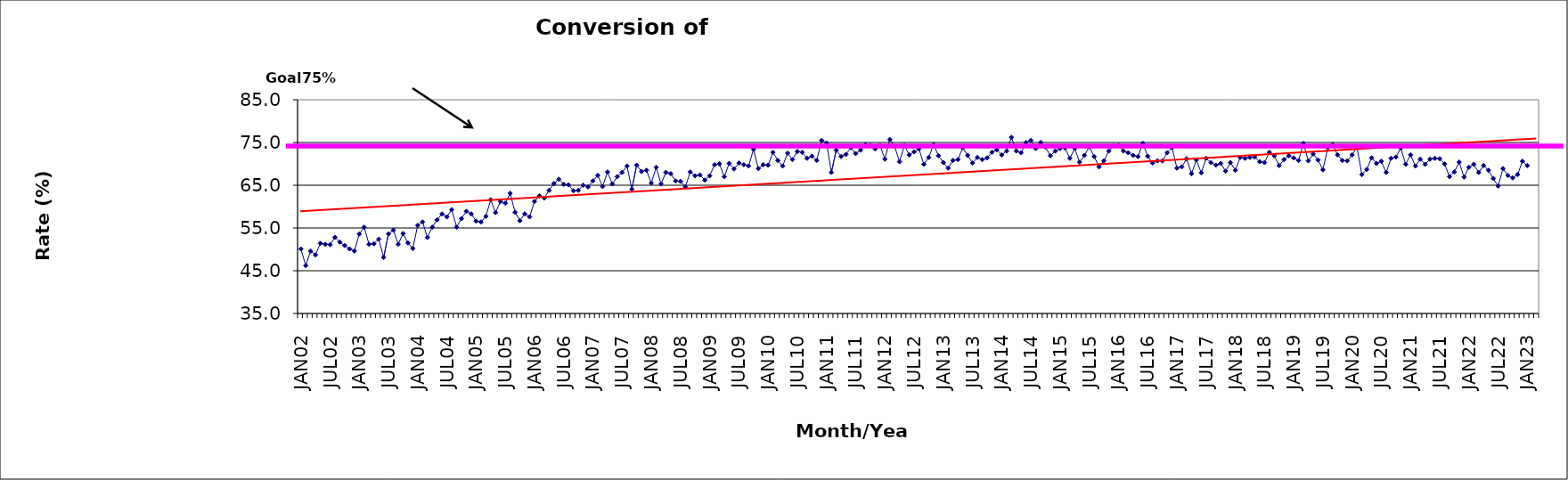
| Category | Series 0 |
|---|---|
| JAN02 | 50.1 |
| FEB02 | 46.2 |
| MAR02 | 49.6 |
| APR02 | 48.7 |
| MAY02 | 51.4 |
| JUN02 | 51.2 |
| JUL02 | 51.1 |
| AUG02 | 52.8 |
| SEP02 | 51.7 |
| OCT02 | 50.9 |
| NOV02 | 50.1 |
| DEC02 | 49.6 |
| JAN03 | 53.6 |
| FEB03 | 55.2 |
| MAR03 | 51.2 |
| APR03 | 51.3 |
| MAY03 | 52.4 |
| JUN03 | 48.1 |
| JUL03 | 53.6 |
| AUG03 | 54.5 |
| SEP03 | 51.2 |
| OCT03 | 53.7 |
| NOV03 | 51.5 |
| DEC03 | 50.2 |
| JAN04 | 55.6 |
| FEB04 | 56.4 |
| MAR04 | 52.8 |
| APR04 | 55.2 |
| MAY04 | 56.9 |
| JUN04 | 58.3 |
| JUL04 | 57.6 |
| AUG04 | 59.3 |
| SEP04 | 55.2 |
| OCT04 | 57.2 |
| NOV04 | 58.9 |
| DEC04 | 58.3 |
| JAN05 | 56.6 |
| FEB05 | 56.4 |
| MAR05 | 57.7 |
| APR05 | 61.6 |
| MAY05 | 58.6 |
| JUN05 | 61.2 |
| JUL05 | 60.8 |
| AUG05 | 63.1 |
| SEP05 | 58.7 |
| OCT05 | 56.7 |
| NOV05 | 58.3 |
| DEC05 | 57.6 |
| JAN06 | 61.2 |
| FEB06 | 62.5 |
| MAR06 | 62 |
| APR06 | 63.8 |
| MAY06 | 65.4 |
| JUN06 | 66.4 |
| JUL06 | 65.2 |
| AUG06 | 65.1 |
| SEP06 | 63.7 |
| OCT06 | 63.8 |
| NOV06 | 65 |
| DEC06 | 64.6 |
| JAN07 | 66 |
| FEB07 | 67.3 |
| MAR07 | 64.7 |
| APR07 | 68.1 |
| MAY07 | 65.3 |
| JUN07 | 67 |
| JUL07 | 68 |
| AUG07 | 69.5 |
| SEP07 | 64.1 |
| OCT07 | 69.7 |
| NOV07 | 68.2 |
| DEC07 | 68.5 |
| JAN08 | 65.5 |
| FEB08 | 69.2 |
| MAR08 | 65.3 |
| APR08 | 68 |
| MAY08 | 67.7 |
| JUN08 | 66 |
| JUL08 | 65.9 |
| AUG08 | 64.6 |
| SEP08 | 68.1 |
| OCT08 | 67.2 |
| NOV08 | 67.4 |
| DEC08 | 66.2 |
| JAN09 | 67.2 |
| FEB09 | 69.8 |
| MAR09 | 70 |
| APR09 | 67 |
| MAY09 | 70.1 |
| JUN09 | 68.8 |
| JUL09 | 70.2 |
| AUG09 | 69.8 |
| SEP09 | 69.5 |
| OCT09 | 73.4 |
| NOV09 | 68.9 |
| DEC09 | 69.8 |
| JAN10 | 69.7 |
| FEB10 | 72.7 |
| MAR10 | 70.8 |
| APR10 | 69.5 |
| MAY10 | 72.5 |
| JUN10 | 71 |
| JUL10 | 72.9 |
| AUG10 | 72.7 |
| SEP10 | 71.3 |
| OCT10 | 71.8 |
| NOV10 | 70.8 |
| DEC10 | 75.5 |
| JAN11 | 74.9 |
| FEB11 | 68 |
| MAR11 | 73.2 |
| APR11 | 71.7 |
| MAY11 | 72.2 |
| JUN11 | 73.8 |
| JUL11 | 72.4 |
| AUG11 | 73.2 |
| SEP11 | 74.5 |
| OCT11 | 74.3 |
| NOV11 | 73.5 |
| DEC11 | 74.3 |
| JAN12 | 71.1 |
| FEB12 | 75.7 |
| MAR12 | 74.1 |
| APR12 | 70.5 |
| MAY12 | 74.3 |
| JUN12 | 72.1 |
| JUL12 | 72.8 |
| AUG12 | 73.5 |
| SEP12 | 69.9 |
| OCT12 | 71.5 |
| NOV12 | 74.5 |
| DEC12 | 71.9 |
| JAN13 | 70.3 |
| FEB13 | 69 |
| MAR13 | 70.8 |
| APR13 | 71 |
| MAY13 | 73.8 |
| JUN13 | 72 |
| JUL13 | 70.2 |
| AUG13 | 71.5 |
| SEP13 | 71 |
| OCT13 | 71.4 |
| NOV13 | 72.7 |
| DEC13 | 73.3 |
| JAN14 | 72.1 |
| FEB14 | 73 |
| MAR14 | 76.2 |
| APR14 | 73 |
| MAY14 | 72.6 |
| JUN14 | 75 |
| JUL14 | 75.5 |
| AUG14 | 73.6 |
| SEP14 | 75 |
| OCT14 | 73.9 |
| NOV14 | 71.9 |
| DEC14 | 73 |
| JAN15 | 73.6 |
| FEB15 | 73.7 |
| MAR15 | 71.3 |
| APR15 | 73.6 |
| MAY15 | 70.4 |
| JUN15 | 72 |
| JUL15 | 74 |
| AUG15 | 71.7 |
| SEP15 | 69.3 |
| OCT15 | 70.7 |
| NOV15 | 73 |
| DEC15 | 74.2 |
| JAN16 | 74.3 |
| FEB16 | 73 |
| MAR16 | 72.6 |
| APR16 | 72 |
| MAY16 | 71.7 |
| JUN16 | 74.8 |
| JUL16 | 71.8 |
| AUG16 | 70.2 |
| SEP16 | 70.7 |
| OCT16 | 70.7 |
| NOV16 | 72.6 |
| DEC16 | 73.8 |
| JAN17 | 69 |
| FEB17 | 69.3 |
| MAR17 | 71.2 |
| APR17 | 67.7 |
| MAY17 | 70.9 |
| JUN17 | 67.9 |
| JUL17 | 71.3 |
| AUG17 | 70.3 |
| SEP17 | 69.7 |
| OCT17 | 70.1 |
| NOV17 | 68.3 |
| DEC17 | 70.3 |
| JAN18 | 68.5 |
| FEB18 | 71.5 |
| MAR18 | 71.3 |
| APR18 | 71.5 |
| MAY18 | 71.6 |
| JUN18 | 70.5 |
| JUL18 | 70.3 |
| AUG18 | 72.7 |
| SEP18 | 71.9 |
| OCT18 | 69.6 |
| NOV18 | 71 |
| DEC18 | 71.9 |
| JAN19 | 71.4 |
| FEB19 | 70.8 |
| MAR19 | 74.8 |
| APR19 | 70.7 |
| MAY19 | 72.3 |
| JUN19 | 70.9 |
| JUL19 | 68.6 |
| AUG19 | 73.8 |
| SEP19 | 74.5 |
| OCT19 | 72.1 |
| NOV19 | 70.8 |
| DEC19 | 70.7 |
| JAN20 | 72.1 |
| FEB20 | 73.9 |
| MAR20 | 67.5 |
| APR20 | 68.7 |
| MAY20 | 71.4 |
| JUN20 | 70.1 |
| JUL20 | 70.6 |
| AUG20 | 68 |
| SEP20 | 71.3 |
| OCT20 | 71.6 |
| NOV20 | 73.7 |
| DEC20 | 69.9 |
| JAN21 | 72.1 |
| FEB21 | 69.5 |
| MAR21 | 71.1 |
| APR21 | 69.9 |
| MAY21 | 71.1 |
| JUN21 | 71.3 |
| JUL21 | 71.2 |
| AUG21 | 70 |
| SEP21 | 67 |
| OCT21 | 68.1 |
| NOV21 | 70.4 |
| DEC21 | 66.9 |
| JAN22 | 69.2 |
| FEB22 | 69.9 |
| MAR22 | 68 |
| APR22 | 69.6 |
| MAY22 | 68.5 |
| JUN22 | 66.6 |
| JUL22 | 64.8 |
| AUG22 | 68.9 |
| SEP22 | 67.3 |
| OCT22 | 66.7 |
| NOV22 | 67.5 |
| DEC22 | 70.6 |
| JAN23 | 69.6 |